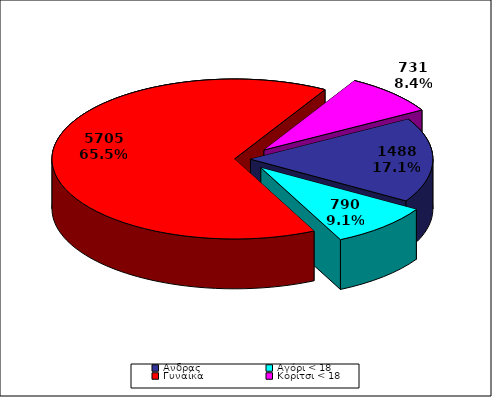
| Category | ΣΥΝΟΛΟ |
|---|---|
| Aνδρας | 1488 |
| Αγόρι < 18 | 790 |
| Γυναίκα | 5705 |
| Κορίτσι < 18 | 731 |